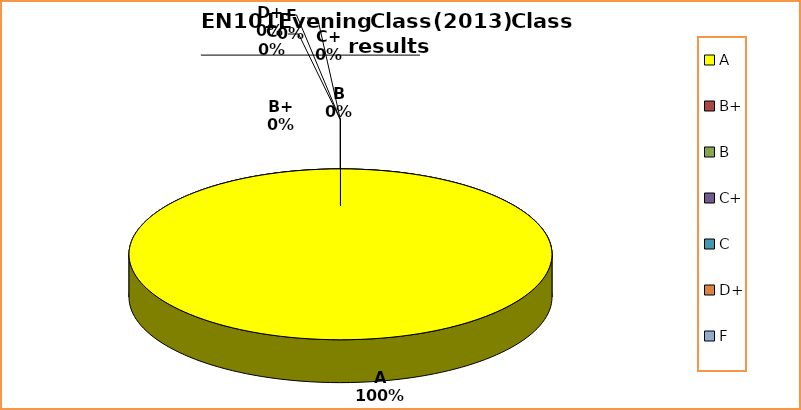
| Category | Series 0 |
|---|---|
| A | 12 |
| B+ | 0 |
| B | 0 |
| C+ | 0 |
| C | 0 |
| D+ | 0 |
| F | 0 |